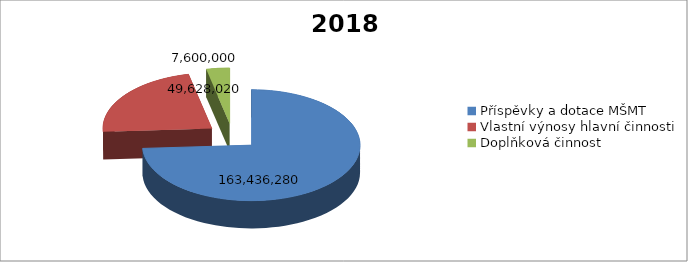
| Category | 2019 |
|---|---|
| Příspěvky a dotace MŠMT | 163436280 |
| Vlastní výnosy hlavní činnosti | 49628020 |
| Doplňková činnost | 7600000 |